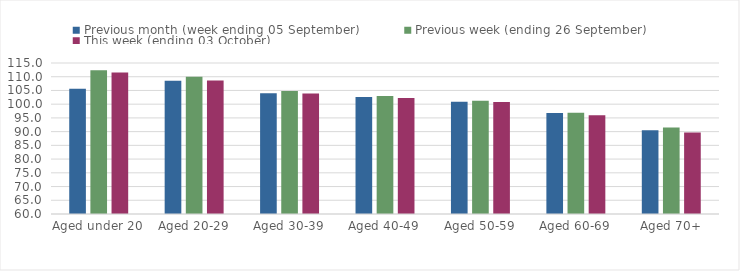
| Category | Previous month (week ending 05 September) | Previous week (ending 26 September) | This week (ending 03 October) |
|---|---|---|---|
| Aged under 20 | 105.64 | 112.36 | 111.51 |
| Aged 20-29 | 108.49 | 110.03 | 108.65 |
| Aged 30-39 | 103.96 | 104.78 | 103.9 |
| Aged 40-49 | 102.6 | 102.94 | 102.29 |
| Aged 50-59 | 100.87 | 101.22 | 100.77 |
| Aged 60-69 | 96.75 | 96.87 | 95.98 |
| Aged 70+ | 90.47 | 91.51 | 89.73 |